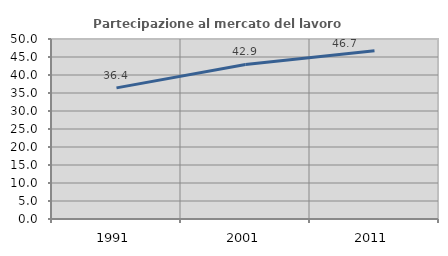
| Category | Partecipazione al mercato del lavoro  femminile |
|---|---|
| 1991.0 | 36.423 |
| 2001.0 | 42.932 |
| 2011.0 | 46.742 |